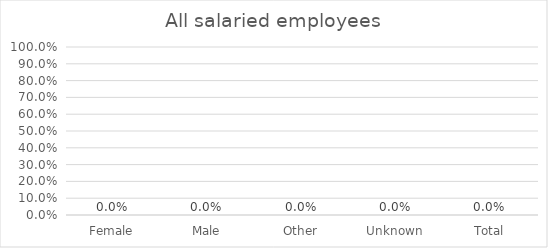
| Category | Series 0 |
|---|---|
| Female | 0 |
| Male | 0 |
| Other | 0 |
| Unknown | 0 |
| Total | 0 |